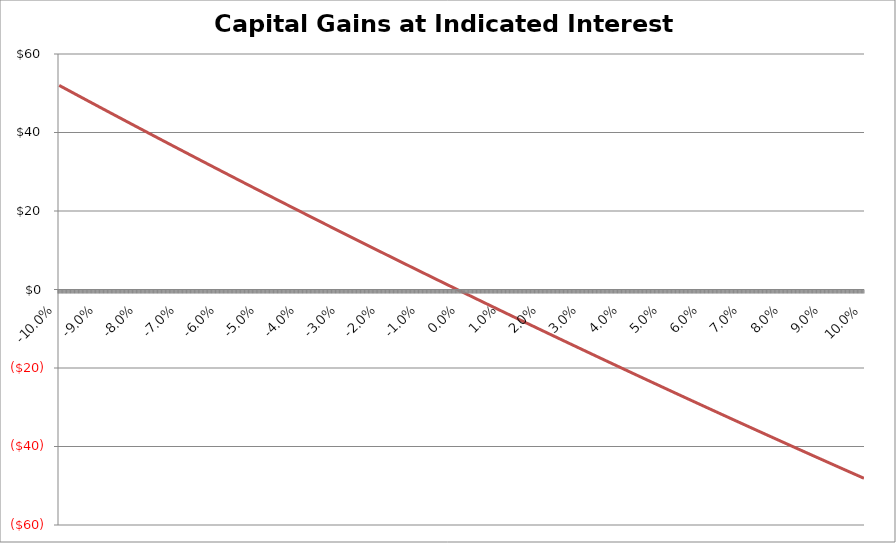
| Category | Capital Gains |
|---|---|
| -0.1 | 52 |
| -0.0999 | 51.945 |
| -0.0998 | 51.889 |
| -0.0997 | 51.834 |
| -0.0996 | 51.779 |
| -0.09949999999999999 | 51.723 |
| -0.09939999999999999 | 51.668 |
| -0.09929999999999999 | 51.613 |
| -0.09919999999999998 | 51.557 |
| -0.09909999999999998 | 51.502 |
| -0.09899999999999998 | 51.447 |
| -0.09889999999999997 | 51.391 |
| -0.09879999999999997 | 51.336 |
| -0.09869999999999997 | 51.281 |
| -0.09859999999999997 | 51.225 |
| -0.09849999999999996 | 51.17 |
| -0.09839999999999996 | 51.115 |
| -0.09829999999999996 | 51.06 |
| -0.09819999999999995 | 51.004 |
| -0.09809999999999995 | 50.949 |
| -0.09799999999999995 | 50.894 |
| -0.09789999999999995 | 50.839 |
| -0.09779999999999994 | 50.783 |
| -0.09769999999999994 | 50.728 |
| -0.09759999999999994 | 50.673 |
| -0.09749999999999993 | 50.618 |
| -0.09739999999999993 | 50.562 |
| -0.09729999999999993 | 50.507 |
| -0.09719999999999993 | 50.452 |
| -0.09709999999999992 | 50.397 |
| -0.09699999999999992 | 50.342 |
| -0.09689999999999992 | 50.286 |
| -0.09679999999999991 | 50.231 |
| -0.09669999999999991 | 50.176 |
| -0.09659999999999991 | 50.121 |
| -0.0964999999999999 | 50.066 |
| -0.0963999999999999 | 50.011 |
| -0.0962999999999999 | 49.955 |
| -0.0961999999999999 | 49.9 |
| -0.0960999999999999 | 49.845 |
| -0.09599999999999989 | 49.79 |
| -0.09589999999999989 | 49.735 |
| -0.09579999999999989 | 49.68 |
| -0.09569999999999988 | 49.625 |
| -0.09559999999999988 | 49.569 |
| -0.09549999999999988 | 49.514 |
| -0.09539999999999987 | 49.459 |
| -0.09529999999999987 | 49.404 |
| -0.09519999999999987 | 49.349 |
| -0.09509999999999987 | 49.294 |
| -0.09499999999999986 | 49.239 |
| -0.09489999999999986 | 49.184 |
| -0.09479999999999986 | 49.129 |
| -0.09469999999999985 | 49.074 |
| -0.09459999999999985 | 49.019 |
| -0.09449999999999985 | 48.964 |
| -0.09439999999999985 | 48.908 |
| -0.09429999999999984 | 48.853 |
| -0.09419999999999984 | 48.798 |
| -0.09409999999999984 | 48.743 |
| -0.09399999999999983 | 48.688 |
| -0.09389999999999983 | 48.633 |
| -0.09379999999999983 | 48.578 |
| -0.09369999999999983 | 48.523 |
| -0.09359999999999982 | 48.468 |
| -0.09349999999999982 | 48.413 |
| -0.09339999999999982 | 48.358 |
| -0.09329999999999981 | 48.303 |
| -0.09319999999999981 | 48.248 |
| -0.09309999999999981 | 48.193 |
| -0.0929999999999998 | 48.138 |
| -0.0928999999999998 | 48.083 |
| -0.0927999999999998 | 48.029 |
| -0.0926999999999998 | 47.974 |
| -0.0925999999999998 | 47.919 |
| -0.09249999999999979 | 47.864 |
| -0.09239999999999979 | 47.809 |
| -0.09229999999999978 | 47.754 |
| -0.09219999999999978 | 47.699 |
| -0.09209999999999978 | 47.644 |
| -0.09199999999999978 | 47.589 |
| -0.09189999999999977 | 47.534 |
| -0.09179999999999977 | 47.479 |
| -0.09169999999999977 | 47.424 |
| -0.09159999999999976 | 47.37 |
| -0.09149999999999976 | 47.315 |
| -0.09139999999999976 | 47.26 |
| -0.09129999999999976 | 47.205 |
| -0.09119999999999975 | 47.15 |
| -0.09109999999999975 | 47.095 |
| -0.09099999999999975 | 47.04 |
| -0.09089999999999974 | 46.985 |
| -0.09079999999999974 | 46.931 |
| -0.09069999999999974 | 46.876 |
| -0.09059999999999974 | 46.821 |
| -0.09049999999999973 | 46.766 |
| -0.09039999999999973 | 46.711 |
| -0.09029999999999973 | 46.657 |
| -0.09019999999999972 | 46.602 |
| -0.09009999999999972 | 46.547 |
| -0.08999999999999972 | 46.492 |
| -0.08989999999999972 | 46.437 |
| -0.08979999999999971 | 46.383 |
| -0.08969999999999971 | 46.328 |
| -0.08959999999999971 | 46.273 |
| -0.0894999999999997 | 46.218 |
| -0.0893999999999997 | 46.164 |
| -0.0892999999999997 | 46.109 |
| -0.0891999999999997 | 46.054 |
| -0.0890999999999997 | 45.999 |
| -0.08899999999999969 | 45.945 |
| -0.08889999999999969 | 45.89 |
| -0.08879999999999968 | 45.835 |
| -0.08869999999999968 | 45.78 |
| -0.08859999999999968 | 45.726 |
| -0.08849999999999968 | 45.671 |
| -0.08839999999999967 | 45.616 |
| -0.08829999999999967 | 45.562 |
| -0.08819999999999967 | 45.507 |
| -0.08809999999999966 | 45.452 |
| -0.08799999999999966 | 45.397 |
| -0.08789999999999966 | 45.343 |
| -0.08779999999999966 | 45.288 |
| -0.08769999999999965 | 45.233 |
| -0.08759999999999965 | 45.179 |
| -0.08749999999999965 | 45.124 |
| -0.08739999999999964 | 45.07 |
| -0.08729999999999964 | 45.015 |
| -0.08719999999999964 | 44.96 |
| -0.08709999999999964 | 44.906 |
| -0.08699999999999963 | 44.851 |
| -0.08689999999999963 | 44.796 |
| -0.08679999999999963 | 44.742 |
| -0.08669999999999962 | 44.687 |
| -0.08659999999999962 | 44.633 |
| -0.08649999999999962 | 44.578 |
| -0.08639999999999962 | 44.523 |
| -0.08629999999999961 | 44.469 |
| -0.08619999999999961 | 44.414 |
| -0.08609999999999961 | 44.36 |
| -0.0859999999999996 | 44.305 |
| -0.0858999999999996 | 44.251 |
| -0.0857999999999996 | 44.196 |
| -0.0856999999999996 | 44.141 |
| -0.0855999999999996 | 44.087 |
| -0.08549999999999959 | 44.032 |
| -0.08539999999999959 | 43.978 |
| -0.08529999999999958 | 43.923 |
| -0.08519999999999958 | 43.869 |
| -0.08509999999999958 | 43.814 |
| -0.08499999999999958 | 43.76 |
| -0.08489999999999957 | 43.705 |
| -0.08479999999999957 | 43.651 |
| -0.08469999999999957 | 43.596 |
| -0.08459999999999956 | 43.542 |
| -0.08449999999999956 | 43.487 |
| -0.08439999999999956 | 43.433 |
| -0.08429999999999956 | 43.378 |
| -0.08419999999999955 | 43.324 |
| -0.08409999999999955 | 43.269 |
| -0.08399999999999955 | 43.215 |
| -0.08389999999999954 | 43.161 |
| -0.08379999999999954 | 43.106 |
| -0.08369999999999954 | 43.052 |
| -0.08359999999999954 | 42.997 |
| -0.08349999999999953 | 42.943 |
| -0.08339999999999953 | 42.888 |
| -0.08329999999999953 | 42.834 |
| -0.08319999999999952 | 42.78 |
| -0.08309999999999952 | 42.725 |
| -0.08299999999999952 | 42.671 |
| -0.08289999999999952 | 42.616 |
| -0.08279999999999951 | 42.562 |
| -0.08269999999999951 | 42.508 |
| -0.08259999999999951 | 42.453 |
| -0.0824999999999995 | 42.399 |
| -0.0823999999999995 | 42.345 |
| -0.0822999999999995 | 42.29 |
| -0.0821999999999995 | 42.236 |
| -0.08209999999999949 | 42.182 |
| -0.08199999999999949 | 42.127 |
| -0.08189999999999949 | 42.073 |
| -0.08179999999999948 | 42.019 |
| -0.08169999999999948 | 41.964 |
| -0.08159999999999948 | 41.91 |
| -0.08149999999999948 | 41.856 |
| -0.08139999999999947 | 41.801 |
| -0.08129999999999947 | 41.747 |
| -0.08119999999999947 | 41.693 |
| -0.08109999999999946 | 41.638 |
| -0.08099999999999946 | 41.584 |
| -0.08089999999999946 | 41.53 |
| -0.08079999999999946 | 41.476 |
| -0.08069999999999945 | 41.421 |
| -0.08059999999999945 | 41.367 |
| -0.08049999999999945 | 41.313 |
| -0.08039999999999944 | 41.259 |
| -0.08029999999999944 | 41.204 |
| -0.08019999999999944 | 41.15 |
| -0.08009999999999944 | 41.096 |
| -0.07999999999999943 | 41.042 |
| -0.07989999999999943 | 40.987 |
| -0.07979999999999943 | 40.933 |
| -0.07969999999999942 | 40.879 |
| -0.07959999999999942 | 40.825 |
| -0.07949999999999942 | 40.771 |
| -0.07939999999999942 | 40.716 |
| -0.07929999999999941 | 40.662 |
| -0.07919999999999941 | 40.608 |
| -0.0790999999999994 | 40.554 |
| -0.0789999999999994 | 40.5 |
| -0.0788999999999994 | 40.446 |
| -0.0787999999999994 | 40.391 |
| -0.0786999999999994 | 40.337 |
| -0.07859999999999939 | 40.283 |
| -0.07849999999999939 | 40.229 |
| -0.07839999999999939 | 40.175 |
| -0.07829999999999938 | 40.121 |
| -0.07819999999999938 | 40.067 |
| -0.07809999999999938 | 40.012 |
| -0.07799999999999938 | 39.958 |
| -0.07789999999999937 | 39.904 |
| -0.07779999999999937 | 39.85 |
| -0.07769999999999937 | 39.796 |
| -0.07759999999999936 | 39.742 |
| -0.07749999999999936 | 39.688 |
| -0.07739999999999936 | 39.634 |
| -0.07729999999999936 | 39.58 |
| -0.07719999999999935 | 39.526 |
| -0.07709999999999935 | 39.472 |
| -0.07699999999999935 | 39.418 |
| -0.07689999999999934 | 39.364 |
| -0.07679999999999934 | 39.309 |
| -0.07669999999999934 | 39.255 |
| -0.07659999999999934 | 39.201 |
| -0.07649999999999933 | 39.147 |
| -0.07639999999999933 | 39.093 |
| -0.07629999999999933 | 39.039 |
| -0.07619999999999932 | 38.985 |
| -0.07609999999999932 | 38.931 |
| -0.07599999999999932 | 38.877 |
| -0.07589999999999932 | 38.823 |
| -0.07579999999999931 | 38.769 |
| -0.07569999999999931 | 38.715 |
| -0.0755999999999993 | 38.661 |
| -0.0754999999999993 | 38.607 |
| -0.0753999999999993 | 38.553 |
| -0.0752999999999993 | 38.5 |
| -0.0751999999999993 | 38.446 |
| -0.07509999999999929 | 38.392 |
| -0.07499999999999929 | 38.338 |
| -0.07489999999999929 | 38.284 |
| -0.07479999999999928 | 38.23 |
| -0.07469999999999928 | 38.176 |
| -0.07459999999999928 | 38.122 |
| -0.07449999999999928 | 38.068 |
| -0.07439999999999927 | 38.014 |
| -0.07429999999999927 | 37.96 |
| -0.07419999999999927 | 37.906 |
| -0.07409999999999926 | 37.852 |
| -0.07399999999999926 | 37.799 |
| -0.07389999999999926 | 37.745 |
| -0.07379999999999926 | 37.691 |
| -0.07369999999999925 | 37.637 |
| -0.07359999999999925 | 37.583 |
| -0.07349999999999925 | 37.529 |
| -0.07339999999999924 | 37.475 |
| -0.07329999999999924 | 37.421 |
| -0.07319999999999924 | 37.368 |
| -0.07309999999999924 | 37.314 |
| -0.07299999999999923 | 37.26 |
| -0.07289999999999923 | 37.206 |
| -0.07279999999999923 | 37.152 |
| -0.07269999999999922 | 37.099 |
| -0.07259999999999922 | 37.045 |
| -0.07249999999999922 | 36.991 |
| -0.07239999999999921 | 36.937 |
| -0.07229999999999921 | 36.883 |
| -0.07219999999999921 | 36.83 |
| -0.0720999999999992 | 36.776 |
| -0.0719999999999992 | 36.722 |
| -0.0718999999999992 | 36.668 |
| -0.0717999999999992 | 36.614 |
| -0.0716999999999992 | 36.561 |
| -0.07159999999999919 | 36.507 |
| -0.07149999999999919 | 36.453 |
| -0.07139999999999919 | 36.399 |
| -0.07129999999999918 | 36.346 |
| -0.07119999999999918 | 36.292 |
| -0.07109999999999918 | 36.238 |
| -0.07099999999999917 | 36.185 |
| -0.07089999999999917 | 36.131 |
| -0.07079999999999917 | 36.077 |
| -0.07069999999999917 | 36.023 |
| -0.07059999999999916 | 35.97 |
| -0.07049999999999916 | 35.916 |
| -0.07039999999999916 | 35.862 |
| -0.07029999999999915 | 35.809 |
| -0.07019999999999915 | 35.755 |
| -0.07009999999999915 | 35.701 |
| -0.06999999999999915 | 35.648 |
| -0.06989999999999914 | 35.594 |
| -0.06979999999999914 | 35.54 |
| -0.06969999999999914 | 35.487 |
| -0.06959999999999913 | 35.433 |
| -0.06949999999999913 | 35.379 |
| -0.06939999999999913 | 35.326 |
| -0.06929999999999913 | 35.272 |
| -0.06919999999999912 | 35.219 |
| -0.06909999999999912 | 35.165 |
| -0.06899999999999912 | 35.111 |
| -0.06889999999999911 | 35.058 |
| -0.06879999999999911 | 35.004 |
| -0.06869999999999911 | 34.951 |
| -0.0685999999999991 | 34.897 |
| -0.0684999999999991 | 34.843 |
| -0.0683999999999991 | 34.79 |
| -0.0682999999999991 | 34.736 |
| -0.0681999999999991 | 34.683 |
| -0.06809999999999909 | 34.629 |
| -0.06799999999999909 | 34.576 |
| -0.06789999999999909 | 34.522 |
| -0.06779999999999908 | 34.468 |
| -0.06769999999999908 | 34.415 |
| -0.06759999999999908 | 34.361 |
| -0.06749999999999907 | 34.308 |
| -0.06739999999999907 | 34.254 |
| -0.06729999999999907 | 34.201 |
| -0.06719999999999907 | 34.147 |
| -0.06709999999999906 | 34.094 |
| -0.06699999999999906 | 34.04 |
| -0.06689999999999906 | 33.987 |
| -0.06679999999999905 | 33.933 |
| -0.06669999999999905 | 33.88 |
| -0.06659999999999905 | 33.826 |
| -0.06649999999999905 | 33.773 |
| -0.06639999999999904 | 33.719 |
| -0.06629999999999904 | 33.666 |
| -0.06619999999999904 | 33.613 |
| -0.06609999999999903 | 33.559 |
| -0.06599999999999903 | 33.506 |
| -0.06589999999999903 | 33.452 |
| -0.06579999999999903 | 33.399 |
| -0.06569999999999902 | 33.345 |
| -0.06559999999999902 | 33.292 |
| -0.06549999999999902 | 33.239 |
| -0.06539999999999901 | 33.185 |
| -0.06529999999999901 | 33.132 |
| -0.06519999999999901 | 33.078 |
| -0.065099999999999 | 33.025 |
| -0.064999999999999 | 32.972 |
| -0.064899999999999 | 32.918 |
| -0.064799999999999 | 32.865 |
| -0.064699999999999 | 32.811 |
| -0.06459999999999899 | 32.758 |
| -0.06449999999999899 | 32.705 |
| -0.06439999999999899 | 32.651 |
| -0.06429999999999898 | 32.598 |
| -0.06419999999999898 | 32.545 |
| -0.06409999999999898 | 32.491 |
| -0.06399999999999897 | 32.438 |
| -0.06389999999999897 | 32.385 |
| -0.06379999999999897 | 32.331 |
| -0.06369999999999897 | 32.278 |
| -0.06359999999999896 | 32.225 |
| -0.06349999999999896 | 32.171 |
| -0.06339999999999896 | 32.118 |
| -0.06329999999999895 | 32.065 |
| -0.06319999999999895 | 32.012 |
| -0.06309999999999895 | 31.958 |
| -0.06299999999999895 | 31.905 |
| -0.06289999999999894 | 31.852 |
| -0.06279999999999894 | 31.798 |
| -0.06269999999999894 | 31.745 |
| -0.06259999999999893 | 31.692 |
| -0.06249999999999893 | 31.639 |
| -0.06239999999999893 | 31.585 |
| -0.062299999999998926 | 31.532 |
| -0.06219999999999892 | 31.479 |
| -0.06209999999999892 | 31.426 |
| -0.06199999999999892 | 31.373 |
| -0.061899999999998914 | 31.319 |
| -0.06179999999999891 | 31.266 |
| -0.06169999999999891 | 31.213 |
| -0.061599999999998906 | 31.16 |
| -0.0614999999999989 | 31.107 |
| -0.0613999999999989 | 31.053 |
| -0.0612999999999989 | 31 |
| -0.061199999999998894 | 30.947 |
| -0.06109999999999889 | 30.894 |
| -0.06099999999999889 | 30.841 |
| -0.060899999999998886 | 30.787 |
| -0.06079999999999888 | 30.734 |
| -0.06069999999999888 | 30.681 |
| -0.06059999999999888 | 30.628 |
| -0.060499999999998874 | 30.575 |
| -0.06039999999999887 | 30.522 |
| -0.06029999999999887 | 30.469 |
| -0.060199999999998866 | 30.416 |
| -0.06009999999999886 | 30.362 |
| -0.05999999999999886 | 30.309 |
| -0.05989999999999886 | 30.256 |
| -0.059799999999998854 | 30.203 |
| -0.05969999999999885 | 30.15 |
| -0.05959999999999885 | 30.097 |
| -0.059499999999998845 | 30.044 |
| -0.05939999999999884 | 29.991 |
| -0.05929999999999884 | 29.938 |
| -0.05919999999999884 | 29.885 |
| -0.059099999999998834 | 29.832 |
| -0.05899999999999883 | 29.778 |
| -0.05889999999999883 | 29.725 |
| -0.058799999999998825 | 29.672 |
| -0.05869999999999882 | 29.619 |
| -0.05859999999999882 | 29.566 |
| -0.05849999999999882 | 29.513 |
| -0.058399999999998814 | 29.46 |
| -0.05829999999999881 | 29.407 |
| -0.05819999999999881 | 29.354 |
| -0.058099999999998805 | 29.301 |
| -0.0579999999999988 | 29.248 |
| -0.0578999999999988 | 29.195 |
| -0.0577999999999988 | 29.142 |
| -0.057699999999998794 | 29.089 |
| -0.05759999999999879 | 29.036 |
| -0.05749999999999879 | 28.983 |
| -0.057399999999998785 | 28.93 |
| -0.05729999999999878 | 28.877 |
| -0.05719999999999878 | 28.824 |
| -0.05709999999999878 | 28.771 |
| -0.056999999999998774 | 28.718 |
| -0.05689999999999877 | 28.666 |
| -0.05679999999999877 | 28.613 |
| -0.056699999999998765 | 28.56 |
| -0.05659999999999876 | 28.507 |
| -0.05649999999999876 | 28.454 |
| -0.05639999999999876 | 28.401 |
| -0.056299999999998754 | 28.348 |
| -0.05619999999999875 | 28.295 |
| -0.05609999999999875 | 28.242 |
| -0.055999999999998745 | 28.189 |
| -0.05589999999999874 | 28.136 |
| -0.05579999999999874 | 28.084 |
| -0.05569999999999874 | 28.031 |
| -0.055599999999998734 | 27.978 |
| -0.05549999999999873 | 27.925 |
| -0.05539999999999873 | 27.872 |
| -0.055299999999998725 | 27.819 |
| -0.05519999999999872 | 27.766 |
| -0.05509999999999872 | 27.714 |
| -0.05499999999999872 | 27.661 |
| -0.054899999999998714 | 27.608 |
| -0.05479999999999871 | 27.555 |
| -0.05469999999999871 | 27.502 |
| -0.054599999999998705 | 27.449 |
| -0.0544999999999987 | 27.397 |
| -0.0543999999999987 | 27.344 |
| -0.0542999999999987 | 27.291 |
| -0.054199999999998694 | 27.238 |
| -0.05409999999999869 | 27.185 |
| -0.05399999999999869 | 27.133 |
| -0.053899999999998685 | 27.08 |
| -0.05379999999999868 | 27.027 |
| -0.05369999999999868 | 26.974 |
| -0.053599999999998676 | 26.921 |
| -0.053499999999998674 | 26.869 |
| -0.05339999999999867 | 26.816 |
| -0.05329999999999867 | 26.763 |
| -0.053199999999998665 | 26.71 |
| -0.05309999999999866 | 26.658 |
| -0.05299999999999866 | 26.605 |
| -0.052899999999998656 | 26.552 |
| -0.052799999999998654 | 26.5 |
| -0.05269999999999865 | 26.447 |
| -0.05259999999999865 | 26.394 |
| -0.052499999999998645 | 26.341 |
| -0.05239999999999864 | 26.289 |
| -0.05229999999999864 | 26.236 |
| -0.052199999999998636 | 26.183 |
| -0.052099999999998634 | 26.131 |
| -0.05199999999999863 | 26.078 |
| -0.05189999999999863 | 26.025 |
| -0.051799999999998625 | 25.973 |
| -0.05169999999999862 | 25.92 |
| -0.05159999999999862 | 25.867 |
| -0.051499999999998616 | 25.815 |
| -0.05139999999999861 | 25.762 |
| -0.05129999999999861 | 25.709 |
| -0.05119999999999861 | 25.657 |
| -0.051099999999998605 | 25.604 |
| -0.0509999999999986 | 25.552 |
| -0.0508999999999986 | 25.499 |
| -0.050799999999998596 | 25.446 |
| -0.05069999999999859 | 25.394 |
| -0.05059999999999859 | 25.341 |
| -0.05049999999999859 | 25.289 |
| -0.050399999999998585 | 25.236 |
| -0.05029999999999858 | 25.183 |
| -0.05019999999999858 | 25.131 |
| -0.050099999999998576 | 25.078 |
| -0.04999999999999857 | 25.026 |
| -0.04989999999999857 | 24.973 |
| -0.04979999999999857 | 24.921 |
| -0.049699999999998565 | 24.868 |
| -0.04959999999999856 | 24.815 |
| -0.04949999999999856 | 24.763 |
| -0.049399999999998556 | 24.71 |
| -0.04929999999999855 | 24.658 |
| -0.04919999999999855 | 24.605 |
| -0.04909999999999855 | 24.553 |
| -0.048999999999998545 | 24.5 |
| -0.04889999999999854 | 24.448 |
| -0.04879999999999854 | 24.395 |
| -0.048699999999998536 | 24.343 |
| -0.04859999999999853 | 24.29 |
| -0.04849999999999853 | 24.238 |
| -0.04839999999999853 | 24.185 |
| -0.048299999999998525 | 24.133 |
| -0.04819999999999852 | 24.08 |
| -0.04809999999999852 | 24.028 |
| -0.047999999999998516 | 23.975 |
| -0.04789999999999851 | 23.923 |
| -0.04779999999999851 | 23.871 |
| -0.04769999999999851 | 23.818 |
| -0.047599999999998505 | 23.766 |
| -0.0474999999999985 | 23.713 |
| -0.0473999999999985 | 23.661 |
| -0.047299999999998496 | 23.608 |
| -0.04719999999999849 | 23.556 |
| -0.04709999999999849 | 23.504 |
| -0.04699999999999849 | 23.451 |
| -0.046899999999998485 | 23.399 |
| -0.04679999999999848 | 23.346 |
| -0.04669999999999848 | 23.294 |
| -0.046599999999998476 | 23.242 |
| -0.04649999999999847 | 23.189 |
| -0.04639999999999847 | 23.137 |
| -0.04629999999999847 | 23.084 |
| -0.046199999999998465 | 23.032 |
| -0.04609999999999846 | 22.98 |
| -0.04599999999999846 | 22.927 |
| -0.045899999999998456 | 22.875 |
| -0.04579999999999845 | 22.823 |
| -0.04569999999999845 | 22.77 |
| -0.04559999999999845 | 22.718 |
| -0.045499999999998444 | 22.666 |
| -0.04539999999999844 | 22.613 |
| -0.04529999999999844 | 22.561 |
| -0.045199999999998436 | 22.509 |
| -0.04509999999999843 | 22.456 |
| -0.04499999999999843 | 22.404 |
| -0.04489999999999843 | 22.352 |
| -0.044799999999998424 | 22.3 |
| -0.04469999999999842 | 22.247 |
| -0.04459999999999842 | 22.195 |
| -0.044499999999998416 | 22.143 |
| -0.04439999999999841 | 22.09 |
| -0.04429999999999841 | 22.038 |
| -0.04419999999999841 | 21.986 |
| -0.044099999999998404 | 21.934 |
| -0.0439999999999984 | 21.881 |
| -0.0438999999999984 | 21.829 |
| -0.043799999999998396 | 21.777 |
| -0.04369999999999839 | 21.725 |
| -0.04359999999999839 | 21.672 |
| -0.04349999999999839 | 21.62 |
| -0.043399999999998384 | 21.568 |
| -0.04329999999999838 | 21.516 |
| -0.04319999999999838 | 21.464 |
| -0.043099999999998376 | 21.411 |
| -0.04299999999999837 | 21.359 |
| -0.04289999999999837 | 21.307 |
| -0.04279999999999837 | 21.255 |
| -0.042699999999998364 | 21.203 |
| -0.04259999999999836 | 21.151 |
| -0.04249999999999836 | 21.098 |
| -0.042399999999998356 | 21.046 |
| -0.04229999999999835 | 20.994 |
| -0.04219999999999835 | 20.942 |
| -0.04209999999999835 | 20.89 |
| -0.041999999999998344 | 20.838 |
| -0.04189999999999834 | 20.785 |
| -0.04179999999999834 | 20.733 |
| -0.041699999999998336 | 20.681 |
| -0.04159999999999833 | 20.629 |
| -0.04149999999999833 | 20.577 |
| -0.04139999999999833 | 20.525 |
| -0.041299999999998324 | 20.473 |
| -0.04119999999999832 | 20.421 |
| -0.04109999999999832 | 20.369 |
| -0.040999999999998316 | 20.316 |
| -0.04089999999999831 | 20.264 |
| -0.04079999999999831 | 20.212 |
| -0.04069999999999831 | 20.16 |
| -0.040599999999998304 | 20.108 |
| -0.0404999999999983 | 20.056 |
| -0.0403999999999983 | 20.004 |
| -0.040299999999998296 | 19.952 |
| -0.04019999999999829 | 19.9 |
| -0.04009999999999829 | 19.848 |
| -0.03999999999999829 | 19.796 |
| -0.039899999999998284 | 19.744 |
| -0.03979999999999828 | 19.692 |
| -0.03969999999999828 | 19.64 |
| -0.039599999999998275 | 19.588 |
| -0.03949999999999827 | 19.536 |
| -0.03939999999999827 | 19.484 |
| -0.03929999999999827 | 19.432 |
| -0.039199999999998264 | 19.38 |
| -0.03909999999999826 | 19.328 |
| -0.03899999999999826 | 19.276 |
| -0.038899999999998255 | 19.224 |
| -0.03879999999999825 | 19.172 |
| -0.03869999999999825 | 19.12 |
| -0.03859999999999825 | 19.068 |
| -0.038499999999998244 | 19.016 |
| -0.03839999999999824 | 18.964 |
| -0.03829999999999824 | 18.912 |
| -0.038199999999998235 | 18.86 |
| -0.03809999999999823 | 18.808 |
| -0.03799999999999823 | 18.756 |
| -0.03789999999999823 | 18.704 |
| -0.037799999999998224 | 18.653 |
| -0.03769999999999822 | 18.601 |
| -0.03759999999999822 | 18.549 |
| -0.037499999999998215 | 18.497 |
| -0.03739999999999821 | 18.445 |
| -0.03729999999999821 | 18.393 |
| -0.03719999999999821 | 18.341 |
| -0.037099999999998204 | 18.289 |
| -0.0369999999999982 | 18.237 |
| -0.0368999999999982 | 18.186 |
| -0.036799999999998195 | 18.134 |
| -0.03669999999999819 | 18.082 |
| -0.03659999999999819 | 18.03 |
| -0.03649999999999819 | 17.978 |
| -0.036399999999998184 | 17.926 |
| -0.03629999999999818 | 17.874 |
| -0.03619999999999818 | 17.823 |
| -0.036099999999998175 | 17.771 |
| -0.03599999999999817 | 17.719 |
| -0.03589999999999817 | 17.667 |
| -0.03579999999999817 | 17.615 |
| -0.035699999999998164 | 17.564 |
| -0.03559999999999816 | 17.512 |
| -0.03549999999999816 | 17.46 |
| -0.035399999999998155 | 17.408 |
| -0.03529999999999815 | 17.356 |
| -0.03519999999999815 | 17.305 |
| -0.03509999999999815 | 17.253 |
| -0.034999999999998144 | 17.201 |
| -0.03489999999999814 | 17.149 |
| -0.03479999999999814 | 17.097 |
| -0.034699999999998135 | 17.046 |
| -0.03459999999999813 | 16.994 |
| -0.03449999999999813 | 16.942 |
| -0.034399999999998127 | 16.891 |
| -0.034299999999998124 | 16.839 |
| -0.03419999999999812 | 16.787 |
| -0.03409999999999812 | 16.735 |
| -0.033999999999998115 | 16.684 |
| -0.03389999999999811 | 16.632 |
| -0.03379999999999811 | 16.58 |
| -0.033699999999998106 | 16.529 |
| -0.033599999999998104 | 16.477 |
| -0.0334999999999981 | 16.425 |
| -0.0333999999999981 | 16.373 |
| -0.033299999999998095 | 16.322 |
| -0.03319999999999809 | 16.27 |
| -0.03309999999999809 | 16.218 |
| -0.032999999999998086 | 16.167 |
| -0.032899999999998084 | 16.115 |
| -0.03279999999999808 | 16.063 |
| -0.03269999999999808 | 16.012 |
| -0.032599999999998075 | 15.96 |
| -0.03249999999999807 | 15.909 |
| -0.03239999999999807 | 15.857 |
| -0.032299999999998066 | 15.805 |
| -0.032199999999998064 | 15.754 |
| -0.03209999999999806 | 15.702 |
| -0.03199999999999806 | 15.65 |
| -0.031899999999998055 | 15.599 |
| -0.03179999999999805 | 15.547 |
| -0.03169999999999805 | 15.496 |
| -0.031599999999998046 | 15.444 |
| -0.03149999999999804 | 15.392 |
| -0.03139999999999804 | 15.341 |
| -0.03129999999999804 | 15.289 |
| -0.03119999999999804 | 15.238 |
| -0.03109999999999804 | 15.186 |
| -0.03099999999999804 | 15.135 |
| -0.03089999999999804 | 15.083 |
| -0.03079999999999804 | 15.031 |
| -0.03069999999999804 | 14.98 |
| -0.030599999999998042 | 14.928 |
| -0.030499999999998043 | 14.877 |
| -0.030399999999998043 | 14.825 |
| -0.030299999999998044 | 14.774 |
| -0.030199999999998044 | 14.722 |
| -0.030099999999998045 | 14.671 |
| -0.029999999999998046 | 14.619 |
| -0.029899999999998046 | 14.568 |
| -0.029799999999998047 | 14.516 |
| -0.029699999999998047 | 14.465 |
| -0.029599999999998048 | 14.413 |
| -0.02949999999999805 | 14.362 |
| -0.02939999999999805 | 14.31 |
| -0.02929999999999805 | 14.259 |
| -0.02919999999999805 | 14.207 |
| -0.02909999999999805 | 14.156 |
| -0.02899999999999805 | 14.105 |
| -0.028899999999998052 | 14.053 |
| -0.028799999999998053 | 14.002 |
| -0.028699999999998053 | 13.95 |
| -0.028599999999998054 | 13.899 |
| -0.028499999999998055 | 13.847 |
| -0.028399999999998055 | 13.796 |
| -0.028299999999998056 | 13.744 |
| -0.028199999999998056 | 13.693 |
| -0.028099999999998057 | 13.642 |
| -0.027999999999998058 | 13.59 |
| -0.02789999999999806 | 13.539 |
| -0.02779999999999806 | 13.487 |
| -0.02769999999999806 | 13.436 |
| -0.02759999999999806 | 13.385 |
| -0.02749999999999806 | 13.333 |
| -0.02739999999999806 | 13.282 |
| -0.027299999999998062 | 13.231 |
| -0.027199999999998063 | 13.179 |
| -0.027099999999998063 | 13.128 |
| -0.026999999999998064 | 13.077 |
| -0.026899999999998064 | 13.025 |
| -0.026799999999998065 | 12.974 |
| -0.026699999999998066 | 12.923 |
| -0.026599999999998066 | 12.871 |
| -0.026499999999998067 | 12.82 |
| -0.026399999999998067 | 12.769 |
| -0.026299999999998068 | 12.717 |
| -0.02619999999999807 | 12.666 |
| -0.02609999999999807 | 12.615 |
| -0.02599999999999807 | 12.563 |
| -0.02589999999999807 | 12.512 |
| -0.02579999999999807 | 12.461 |
| -0.02569999999999807 | 12.409 |
| -0.025599999999998072 | 12.358 |
| -0.025499999999998073 | 12.307 |
| -0.025399999999998073 | 12.256 |
| -0.025299999999998074 | 12.204 |
| -0.025199999999998075 | 12.153 |
| -0.025099999999998075 | 12.102 |
| -0.024999999999998076 | 12.051 |
| -0.024899999999998076 | 11.999 |
| -0.024799999999998077 | 11.948 |
| -0.024699999999998078 | 11.897 |
| -0.024599999999998078 | 11.846 |
| -0.02449999999999808 | 11.794 |
| -0.02439999999999808 | 11.743 |
| -0.02429999999999808 | 11.692 |
| -0.02419999999999808 | 11.641 |
| -0.02409999999999808 | 11.59 |
| -0.023999999999998082 | 11.538 |
| -0.023899999999998083 | 11.487 |
| -0.023799999999998083 | 11.436 |
| -0.023699999999998084 | 11.385 |
| -0.023599999999998084 | 11.334 |
| -0.023499999999998085 | 11.283 |
| -0.023399999999998086 | 11.231 |
| -0.023299999999998086 | 11.18 |
| -0.023199999999998087 | 11.129 |
| -0.023099999999998087 | 11.078 |
| -0.022999999999998088 | 11.027 |
| -0.02289999999999809 | 10.976 |
| -0.02279999999999809 | 10.925 |
| -0.02269999999999809 | 10.873 |
| -0.02259999999999809 | 10.822 |
| -0.02249999999999809 | 10.771 |
| -0.02239999999999809 | 10.72 |
| -0.022299999999998092 | 10.669 |
| -0.022199999999998093 | 10.618 |
| -0.022099999999998093 | 10.567 |
| -0.021999999999998094 | 10.516 |
| -0.021899999999998095 | 10.465 |
| -0.021799999999998095 | 10.414 |
| -0.021699999999998096 | 10.362 |
| -0.021599999999998096 | 10.311 |
| -0.021499999999998097 | 10.26 |
| -0.021399999999998098 | 10.209 |
| -0.021299999999998098 | 10.158 |
| -0.0211999999999981 | 10.107 |
| -0.0210999999999981 | 10.056 |
| -0.0209999999999981 | 10.005 |
| -0.0208999999999981 | 9.954 |
| -0.0207999999999981 | 9.903 |
| -0.020699999999998102 | 9.852 |
| -0.020599999999998102 | 9.801 |
| -0.020499999999998103 | 9.75 |
| -0.020399999999998104 | 9.699 |
| -0.020299999999998104 | 9.648 |
| -0.020199999999998105 | 9.597 |
| -0.020099999999998105 | 9.546 |
| -0.019999999999998106 | 9.495 |
| -0.019899999999998107 | 9.444 |
| -0.019799999999998107 | 9.393 |
| -0.019699999999998108 | 9.342 |
| -0.01959999999999811 | 9.291 |
| -0.01949999999999811 | 9.24 |
| -0.01939999999999811 | 9.189 |
| -0.01929999999999811 | 9.138 |
| -0.01919999999999811 | 9.087 |
| -0.01909999999999811 | 9.036 |
| -0.018999999999998112 | 8.985 |
| -0.018899999999998113 | 8.934 |
| -0.018799999999998113 | 8.884 |
| -0.018699999999998114 | 8.833 |
| -0.018599999999998115 | 8.782 |
| -0.018499999999998115 | 8.731 |
| -0.018399999999998116 | 8.68 |
| -0.018299999999998116 | 8.629 |
| -0.018199999999998117 | 8.578 |
| -0.018099999999998118 | 8.527 |
| -0.017999999999998118 | 8.476 |
| -0.01789999999999812 | 8.425 |
| -0.01779999999999812 | 8.375 |
| -0.01769999999999812 | 8.324 |
| -0.01759999999999812 | 8.273 |
| -0.01749999999999812 | 8.222 |
| -0.017399999999998122 | 8.171 |
| -0.017299999999998122 | 8.12 |
| -0.017199999999998123 | 8.069 |
| -0.017099999999998124 | 8.019 |
| -0.016999999999998124 | 7.968 |
| -0.016899999999998125 | 7.917 |
| -0.016799999999998125 | 7.866 |
| -0.016699999999998126 | 7.815 |
| -0.016599999999998127 | 7.764 |
| -0.016499999999998127 | 7.714 |
| -0.016399999999998128 | 7.663 |
| -0.01629999999999813 | 7.612 |
| -0.01619999999999813 | 7.561 |
| -0.01609999999999813 | 7.51 |
| -0.01599999999999813 | 7.46 |
| -0.01589999999999813 | 7.409 |
| -0.01579999999999813 | 7.358 |
| -0.015699999999998132 | 7.307 |
| -0.015599999999998133 | 7.257 |
| -0.015499999999998133 | 7.206 |
| -0.015399999999998134 | 7.155 |
| -0.015299999999998135 | 7.104 |
| -0.015199999999998135 | 7.054 |
| -0.015099999999998136 | 7.003 |
| -0.014999999999998136 | 6.952 |
| -0.014899999999998137 | 6.901 |
| -0.014799999999998138 | 6.851 |
| -0.014699999999998138 | 6.8 |
| -0.014599999999998139 | 6.749 |
| -0.01449999999999814 | 6.699 |
| -0.01439999999999814 | 6.648 |
| -0.01429999999999814 | 6.597 |
| -0.014199999999998141 | 6.546 |
| -0.014099999999998142 | 6.496 |
| -0.013999999999998142 | 6.445 |
| -0.013899999999998143 | 6.394 |
| -0.013799999999998144 | 6.344 |
| -0.013699999999998144 | 6.293 |
| -0.013599999999998145 | 6.242 |
| -0.013499999999998145 | 6.192 |
| -0.013399999999998146 | 6.141 |
| -0.013299999999998147 | 6.091 |
| -0.013199999999998147 | 6.04 |
| -0.013099999999998148 | 5.989 |
| -0.012999999999998148 | 5.939 |
| -0.012899999999998149 | 5.888 |
| -0.01279999999999815 | 5.837 |
| -0.01269999999999815 | 5.787 |
| -0.012599999999998151 | 5.736 |
| -0.012499999999998151 | 5.686 |
| -0.012399999999998152 | 5.635 |
| -0.012299999999998153 | 5.584 |
| -0.012199999999998153 | 5.534 |
| -0.012099999999998154 | 5.483 |
| -0.011999999999998155 | 5.433 |
| -0.011899999999998155 | 5.382 |
| -0.011799999999998156 | 5.331 |
| -0.011699999999998156 | 5.281 |
| -0.011599999999998157 | 5.23 |
| -0.011499999999998158 | 5.18 |
| -0.011399999999998158 | 5.129 |
| -0.011299999999998159 | 5.079 |
| -0.01119999999999816 | 5.028 |
| -0.01109999999999816 | 4.978 |
| -0.01099999999999816 | 4.927 |
| -0.010899999999998161 | 4.877 |
| -0.010799999999998162 | 4.826 |
| -0.010699999999998162 | 4.776 |
| -0.010599999999998163 | 4.725 |
| -0.010499999999998164 | 4.675 |
| -0.010399999999998164 | 4.624 |
| -0.010299999999998165 | 4.574 |
| -0.010199999999998165 | 4.523 |
| -0.010099999999998166 | 4.473 |
| -0.009999999999998167 | 4.422 |
| -0.009899999999998167 | 4.372 |
| -0.009799999999998168 | 4.321 |
| -0.009699999999998168 | 4.271 |
| -0.009599999999998169 | 4.22 |
| -0.00949999999999817 | 4.17 |
| -0.00939999999999817 | 4.119 |
| -0.00929999999999817 | 4.069 |
| -0.009199999999998171 | 4.018 |
| -0.009099999999998172 | 3.968 |
| -0.008999999999998173 | 3.918 |
| -0.008899999999998173 | 3.867 |
| -0.008799999999998174 | 3.817 |
| -0.008699999999998174 | 3.766 |
| -0.008599999999998175 | 3.716 |
| -0.008499999999998176 | 3.666 |
| -0.008399999999998176 | 3.615 |
| -0.008299999999998177 | 3.565 |
| -0.008199999999998177 | 3.514 |
| -0.008099999999998178 | 3.464 |
| -0.007999999999998179 | 3.414 |
| -0.00789999999999818 | 3.363 |
| -0.007799999999998179 | 3.313 |
| -0.007699999999998179 | 3.263 |
| -0.0075999999999981785 | 3.212 |
| -0.007499999999998178 | 3.162 |
| -0.007399999999998178 | 3.112 |
| -0.007299999999998178 | 3.061 |
| -0.0071999999999981775 | 3.011 |
| -0.007099999999998177 | 2.961 |
| -0.006999999999998177 | 2.91 |
| -0.006899999999998177 | 2.86 |
| -0.006799999999998176 | 2.81 |
| -0.006699999999998176 | 2.759 |
| -0.006599999999998176 | 2.709 |
| -0.006499999999998176 | 2.659 |
| -0.006399999999998175 | 2.608 |
| -0.006299999999998175 | 2.558 |
| -0.006199999999998175 | 2.508 |
| -0.006099999999998175 | 2.457 |
| -0.005999999999998174 | 2.407 |
| -0.005899999999998174 | 2.357 |
| -0.005799999999998174 | 2.307 |
| -0.0056999999999981735 | 2.256 |
| -0.005599999999998173 | 2.206 |
| -0.005499999999998173 | 2.156 |
| -0.005399999999998173 | 2.106 |
| -0.0052999999999981725 | 2.055 |
| -0.005199999999998172 | 2.005 |
| -0.005099999999998172 | 1.955 |
| -0.004999999999998172 | 1.905 |
| -0.0048999999999981714 | 1.855 |
| -0.004799999999998171 | 1.804 |
| -0.004699999999998171 | 1.754 |
| -0.004599999999998171 | 1.704 |
| -0.00449999999999817 | 1.654 |
| -0.00439999999999817 | 1.604 |
| -0.00429999999999817 | 1.553 |
| -0.00419999999999817 | 1.503 |
| -0.004099999999998169 | 1.453 |
| -0.003999999999998169 | 1.403 |
| -0.0038999999999981693 | 1.353 |
| -0.0037999999999981694 | 1.302 |
| -0.0036999999999981696 | 1.252 |
| -0.0035999999999981698 | 1.202 |
| -0.00349999999999817 | 1.152 |
| -0.00339999999999817 | 1.102 |
| -0.0032999999999981703 | 1.052 |
| -0.0031999999999981705 | 1.002 |
| -0.0030999999999981706 | 0.951 |
| -0.002999999999998171 | 0.901 |
| -0.002899999999998171 | 0.851 |
| -0.002799999999998171 | 0.801 |
| -0.0026999999999981713 | 0.751 |
| -0.0025999999999981715 | 0.701 |
| -0.0024999999999981717 | 0.651 |
| -0.002399999999998172 | 0.601 |
| -0.002299999999998172 | 0.551 |
| -0.002199999999998172 | 0.501 |
| -0.0020999999999981723 | 0.45 |
| -0.0019999999999981725 | 0.4 |
| -0.0018999999999981725 | 0.35 |
| -0.0017999999999981724 | 0.3 |
| -0.0016999999999981724 | 0.25 |
| -0.0015999999999981723 | 0.2 |
| -0.0014999999999981723 | 0.15 |
| -0.0013999999999981722 | 0.1 |
| -0.0012999999999981722 | 0.05 |
| -0.0011999999999981721 | 0 |
| -0.001099999999998172 | -0.05 |
| -0.000999999999998172 | -0.1 |
| -0.000899999999998172 | -0.15 |
| -0.000799999999998172 | -0.2 |
| -0.0006999999999981719 | -0.25 |
| -0.0005999999999981719 | -0.3 |
| -0.0004999999999981718 | -0.35 |
| -0.00039999999999817184 | -0.4 |
| -0.00029999999999817185 | -0.45 |
| -0.00019999999999817185 | -0.5 |
| -9.999999999817185e-05 | -0.55 |
| 1.8281545981907454e-15 | -0.583 |
| 0.00010000000000182816 | -0.65 |
| 0.00020000000000182816 | -0.7 |
| 0.00030000000000182816 | -0.75 |
| 0.00040000000000182815 | -0.8 |
| 0.0005000000000018282 | -0.85 |
| 0.0006000000000018282 | -0.9 |
| 0.0007000000000018283 | -0.95 |
| 0.0008000000000018283 | -1 |
| 0.0009000000000018284 | -1.05 |
| 0.0010000000000018284 | -1.099 |
| 0.0011000000000018285 | -1.149 |
| 0.0012000000000018285 | -1.199 |
| 0.0013000000000018286 | -1.249 |
| 0.0014000000000018286 | -1.299 |
| 0.0015000000000018286 | -1.349 |
| 0.0016000000000018287 | -1.399 |
| 0.0017000000000018287 | -1.449 |
| 0.0018000000000018288 | -1.499 |
| 0.0019000000000018288 | -1.549 |
| 0.002000000000001829 | -1.598 |
| 0.0021000000000018287 | -1.648 |
| 0.0022000000000018285 | -1.698 |
| 0.0023000000000018284 | -1.748 |
| 0.002400000000001828 | -1.798 |
| 0.002500000000001828 | -1.848 |
| 0.002600000000001828 | -1.898 |
| 0.0027000000000018277 | -1.947 |
| 0.0028000000000018275 | -1.997 |
| 0.0029000000000018273 | -2.047 |
| 0.003000000000001827 | -2.097 |
| 0.003100000000001827 | -2.147 |
| 0.003200000000001827 | -2.196 |
| 0.0033000000000018266 | -2.246 |
| 0.0034000000000018265 | -2.296 |
| 0.0035000000000018263 | -2.346 |
| 0.003600000000001826 | -2.396 |
| 0.003700000000001826 | -2.445 |
| 0.003800000000001826 | -2.495 |
| 0.0039000000000018256 | -2.545 |
| 0.004000000000001826 | -2.595 |
| 0.004100000000001826 | -2.645 |
| 0.004200000000001826 | -2.694 |
| 0.004300000000001827 | -2.744 |
| 0.004400000000001827 | -2.794 |
| 0.004500000000001827 | -2.844 |
| 0.0046000000000018275 | -2.893 |
| 0.004700000000001828 | -2.943 |
| 0.004800000000001828 | -2.993 |
| 0.004900000000001828 | -3.043 |
| 0.0050000000000018285 | -3.092 |
| 0.005100000000001829 | -3.142 |
| 0.005200000000001829 | -3.192 |
| 0.005300000000001829 | -3.241 |
| 0.0054000000000018296 | -3.291 |
| 0.00550000000000183 | -3.341 |
| 0.00560000000000183 | -3.391 |
| 0.00570000000000183 | -3.44 |
| 0.005800000000001831 | -3.49 |
| 0.005900000000001831 | -3.54 |
| 0.006000000000001831 | -3.589 |
| 0.006100000000001831 | -3.639 |
| 0.006200000000001832 | -3.689 |
| 0.006300000000001832 | -3.738 |
| 0.006400000000001832 | -3.788 |
| 0.0065000000000018324 | -3.838 |
| 0.006600000000001833 | -3.887 |
| 0.006700000000001833 | -3.937 |
| 0.006800000000001833 | -3.986 |
| 0.0069000000000018335 | -4.036 |
| 0.007000000000001834 | -4.086 |
| 0.007100000000001834 | -4.135 |
| 0.007200000000001834 | -4.185 |
| 0.0073000000000018345 | -4.235 |
| 0.007400000000001835 | -4.284 |
| 0.007500000000001835 | -4.334 |
| 0.007600000000001835 | -4.383 |
| 0.007700000000001836 | -4.433 |
| 0.007800000000001836 | -4.483 |
| 0.007900000000001836 | -4.532 |
| 0.008000000000001836 | -4.582 |
| 0.008100000000001835 | -4.631 |
| 0.008200000000001834 | -4.681 |
| 0.008300000000001834 | -4.73 |
| 0.008400000000001833 | -4.78 |
| 0.008500000000001832 | -4.829 |
| 0.008600000000001832 | -4.879 |
| 0.008700000000001831 | -4.929 |
| 0.00880000000000183 | -4.978 |
| 0.00890000000000183 | -5.028 |
| 0.00900000000000183 | -5.077 |
| 0.009100000000001829 | -5.127 |
| 0.009200000000001828 | -5.176 |
| 0.009300000000001828 | -5.226 |
| 0.009400000000001827 | -5.275 |
| 0.009500000000001826 | -5.325 |
| 0.009600000000001826 | -5.374 |
| 0.009700000000001825 | -5.424 |
| 0.009800000000001825 | -5.473 |
| 0.009900000000001824 | -5.523 |
| 0.010000000000001823 | -5.572 |
| 0.010100000000001823 | -5.622 |
| 0.010200000000001822 | -5.671 |
| 0.010300000000001822 | -5.721 |
| 0.010400000000001821 | -5.77 |
| 0.01050000000000182 | -5.819 |
| 0.01060000000000182 | -5.869 |
| 0.01070000000000182 | -5.918 |
| 0.010800000000001819 | -5.968 |
| 0.010900000000001818 | -6.017 |
| 0.011000000000001817 | -6.067 |
| 0.011100000000001817 | -6.116 |
| 0.011200000000001816 | -6.165 |
| 0.011300000000001816 | -6.215 |
| 0.011400000000001815 | -6.264 |
| 0.011500000000001814 | -6.314 |
| 0.011600000000001814 | -6.363 |
| 0.011700000000001813 | -6.412 |
| 0.011800000000001813 | -6.462 |
| 0.011900000000001812 | -6.511 |
| 0.012000000000001811 | -6.561 |
| 0.01210000000000181 | -6.61 |
| 0.01220000000000181 | -6.659 |
| 0.01230000000000181 | -6.709 |
| 0.012400000000001809 | -6.758 |
| 0.012500000000001808 | -6.807 |
| 0.012600000000001808 | -6.857 |
| 0.012700000000001807 | -6.906 |
| 0.012800000000001806 | -6.955 |
| 0.012900000000001806 | -7.005 |
| 0.013000000000001805 | -7.054 |
| 0.013100000000001805 | -7.103 |
| 0.013200000000001804 | -7.153 |
| 0.013300000000001803 | -7.202 |
| 0.013400000000001803 | -7.251 |
| 0.013500000000001802 | -7.301 |
| 0.013600000000001802 | -7.35 |
| 0.013700000000001801 | -7.399 |
| 0.0138000000000018 | -7.449 |
| 0.0139000000000018 | -7.498 |
| 0.0140000000000018 | -7.547 |
| 0.014100000000001799 | -7.596 |
| 0.014200000000001798 | -7.646 |
| 0.014300000000001797 | -7.695 |
| 0.014400000000001797 | -7.744 |
| 0.014500000000001796 | -7.793 |
| 0.014600000000001796 | -7.843 |
| 0.014700000000001795 | -7.892 |
| 0.014800000000001794 | -7.941 |
| 0.014900000000001794 | -7.99 |
| 0.015000000000001793 | -8.04 |
| 0.015100000000001793 | -8.089 |
| 0.015200000000001792 | -8.138 |
| 0.015300000000001791 | -8.187 |
| 0.01540000000000179 | -8.237 |
| 0.01550000000000179 | -8.286 |
| 0.01560000000000179 | -8.335 |
| 0.01570000000000179 | -8.384 |
| 0.01580000000000179 | -8.433 |
| 0.015900000000001788 | -8.483 |
| 0.016000000000001787 | -8.532 |
| 0.016100000000001786 | -8.581 |
| 0.016200000000001786 | -8.63 |
| 0.016300000000001785 | -8.679 |
| 0.016400000000001785 | -8.728 |
| 0.016500000000001784 | -8.778 |
| 0.016600000000001783 | -8.827 |
| 0.016700000000001783 | -8.876 |
| 0.016800000000001782 | -8.925 |
| 0.01690000000000178 | -8.974 |
| 0.01700000000000178 | -9.023 |
| 0.01710000000000178 | -9.072 |
| 0.01720000000000178 | -9.122 |
| 0.01730000000000178 | -9.171 |
| 0.01740000000000178 | -9.22 |
| 0.017500000000001778 | -9.269 |
| 0.017600000000001777 | -9.318 |
| 0.017700000000001777 | -9.367 |
| 0.017800000000001776 | -9.416 |
| 0.017900000000001776 | -9.465 |
| 0.018000000000001775 | -9.514 |
| 0.018100000000001774 | -9.563 |
| 0.018200000000001774 | -9.613 |
| 0.018300000000001773 | -9.662 |
| 0.018400000000001773 | -9.711 |
| 0.018500000000001772 | -9.76 |
| 0.01860000000000177 | -9.809 |
| 0.01870000000000177 | -9.858 |
| 0.01880000000000177 | -9.907 |
| 0.01890000000000177 | -9.956 |
| 0.01900000000000177 | -10.005 |
| 0.01910000000000177 | -10.054 |
| 0.019200000000001768 | -10.103 |
| 0.019300000000001767 | -10.152 |
| 0.019400000000001767 | -10.201 |
| 0.019500000000001766 | -10.25 |
| 0.019600000000001765 | -10.299 |
| 0.019700000000001765 | -10.348 |
| 0.019800000000001764 | -10.397 |
| 0.019900000000001764 | -10.446 |
| 0.020000000000001763 | -10.495 |
| 0.020100000000001762 | -10.544 |
| 0.02020000000000176 | -10.593 |
| 0.02030000000000176 | -10.642 |
| 0.02040000000000176 | -10.691 |
| 0.02050000000000176 | -10.74 |
| 0.02060000000000176 | -10.789 |
| 0.02070000000000176 | -10.838 |
| 0.020800000000001758 | -10.887 |
| 0.020900000000001757 | -10.936 |
| 0.021000000000001757 | -10.985 |
| 0.021100000000001756 | -11.034 |
| 0.021200000000001756 | -11.083 |
| 0.021300000000001755 | -11.131 |
| 0.021400000000001754 | -11.18 |
| 0.021500000000001754 | -11.229 |
| 0.021600000000001753 | -11.278 |
| 0.021700000000001753 | -11.327 |
| 0.021800000000001752 | -11.376 |
| 0.02190000000000175 | -11.425 |
| 0.02200000000000175 | -11.474 |
| 0.02210000000000175 | -11.523 |
| 0.02220000000000175 | -11.572 |
| 0.02230000000000175 | -11.62 |
| 0.02240000000000175 | -11.669 |
| 0.022500000000001748 | -11.718 |
| 0.022600000000001747 | -11.767 |
| 0.022700000000001747 | -11.816 |
| 0.022800000000001746 | -11.865 |
| 0.022900000000001745 | -11.914 |
| 0.023000000000001745 | -11.962 |
| 0.023100000000001744 | -12.011 |
| 0.023200000000001744 | -12.06 |
| 0.023300000000001743 | -12.109 |
| 0.023400000000001742 | -12.158 |
| 0.02350000000000174 | -12.207 |
| 0.02360000000000174 | -12.255 |
| 0.02370000000000174 | -12.304 |
| 0.02380000000000174 | -12.353 |
| 0.02390000000000174 | -12.402 |
| 0.02400000000000174 | -12.451 |
| 0.024100000000001738 | -12.499 |
| 0.024200000000001737 | -12.548 |
| 0.024300000000001737 | -12.597 |
| 0.024400000000001736 | -12.646 |
| 0.024500000000001736 | -12.694 |
| 0.024600000000001735 | -12.743 |
| 0.024700000000001734 | -12.792 |
| 0.024800000000001734 | -12.841 |
| 0.024900000000001733 | -12.89 |
| 0.025000000000001733 | -12.938 |
| 0.025100000000001732 | -12.987 |
| 0.02520000000000173 | -13.036 |
| 0.02530000000000173 | -13.084 |
| 0.02540000000000173 | -13.133 |
| 0.02550000000000173 | -13.182 |
| 0.02560000000000173 | -13.231 |
| 0.02570000000000173 | -13.279 |
| 0.025800000000001728 | -13.328 |
| 0.025900000000001727 | -13.377 |
| 0.026000000000001727 | -13.425 |
| 0.026100000000001726 | -13.474 |
| 0.026200000000001725 | -13.523 |
| 0.026300000000001725 | -13.572 |
| 0.026400000000001724 | -13.62 |
| 0.026500000000001724 | -13.669 |
| 0.026600000000001723 | -13.718 |
| 0.026700000000001722 | -13.766 |
| 0.026800000000001722 | -13.815 |
| 0.02690000000000172 | -13.864 |
| 0.02700000000000172 | -13.912 |
| 0.02710000000000172 | -13.961 |
| 0.02720000000000172 | -14.009 |
| 0.02730000000000172 | -14.058 |
| 0.027400000000001718 | -14.107 |
| 0.027500000000001718 | -14.155 |
| 0.027600000000001717 | -14.204 |
| 0.027700000000001716 | -14.253 |
| 0.027800000000001716 | -14.301 |
| 0.027900000000001715 | -14.35 |
| 0.028000000000001714 | -14.398 |
| 0.028100000000001714 | -14.447 |
| 0.028200000000001713 | -14.496 |
| 0.028300000000001713 | -14.544 |
| 0.028400000000001712 | -14.593 |
| 0.02850000000000171 | -14.641 |
| 0.02860000000000171 | -14.69 |
| 0.02870000000000171 | -14.739 |
| 0.02880000000000171 | -14.787 |
| 0.02890000000000171 | -14.836 |
| 0.02900000000000171 | -14.884 |
| 0.029100000000001708 | -14.933 |
| 0.029200000000001707 | -14.981 |
| 0.029300000000001707 | -15.03 |
| 0.029400000000001706 | -15.078 |
| 0.029500000000001705 | -15.127 |
| 0.029600000000001705 | -15.175 |
| 0.029700000000001704 | -15.224 |
| 0.029800000000001704 | -15.272 |
| 0.029900000000001703 | -15.321 |
| 0.030000000000001702 | -15.369 |
| 0.030100000000001702 | -15.418 |
| 0.0302000000000017 | -15.466 |
| 0.0303000000000017 | -15.515 |
| 0.0304000000000017 | -15.563 |
| 0.0305000000000017 | -15.612 |
| 0.0306000000000017 | -15.66 |
| 0.030700000000001698 | -15.709 |
| 0.030800000000001698 | -15.757 |
| 0.030900000000001697 | -15.806 |
| 0.031000000000001696 | -15.854 |
| 0.031100000000001696 | -15.903 |
| 0.031200000000001695 | -15.951 |
| 0.031300000000001695 | -16 |
| 0.0314000000000017 | -16.048 |
| 0.0315000000000017 | -16.096 |
| 0.0316000000000017 | -16.145 |
| 0.031700000000001706 | -16.193 |
| 0.03180000000000171 | -16.242 |
| 0.03190000000000171 | -16.29 |
| 0.032000000000001715 | -16.339 |
| 0.03210000000000172 | -16.387 |
| 0.03220000000000172 | -16.435 |
| 0.03230000000000172 | -16.484 |
| 0.032400000000001726 | -16.532 |
| 0.03250000000000173 | -16.581 |
| 0.03260000000000173 | -16.629 |
| 0.032700000000001735 | -16.677 |
| 0.03280000000000174 | -16.726 |
| 0.03290000000000174 | -16.774 |
| 0.03300000000000174 | -16.822 |
| 0.033100000000001746 | -16.871 |
| 0.03320000000000175 | -16.919 |
| 0.03330000000000175 | -16.967 |
| 0.033400000000001755 | -17.016 |
| 0.03350000000000176 | -17.064 |
| 0.03360000000000176 | -17.113 |
| 0.03370000000000176 | -17.161 |
| 0.033800000000001766 | -17.209 |
| 0.03390000000000177 | -17.257 |
| 0.03400000000000177 | -17.306 |
| 0.034100000000001775 | -17.354 |
| 0.03420000000000178 | -17.402 |
| 0.03430000000000178 | -17.451 |
| 0.03440000000000178 | -17.499 |
| 0.034500000000001786 | -17.547 |
| 0.03460000000000179 | -17.596 |
| 0.03470000000000179 | -17.644 |
| 0.034800000000001795 | -17.692 |
| 0.0349000000000018 | -17.74 |
| 0.0350000000000018 | -17.789 |
| 0.0351000000000018 | -17.837 |
| 0.035200000000001806 | -17.885 |
| 0.03530000000000181 | -17.933 |
| 0.03540000000000181 | -17.982 |
| 0.035500000000001815 | -18.03 |
| 0.03560000000000182 | -18.078 |
| 0.03570000000000182 | -18.126 |
| 0.03580000000000182 | -18.175 |
| 0.035900000000001826 | -18.223 |
| 0.03600000000000183 | -18.271 |
| 0.03610000000000183 | -18.319 |
| 0.036200000000001835 | -18.368 |
| 0.03630000000000184 | -18.416 |
| 0.03640000000000184 | -18.464 |
| 0.036500000000001843 | -18.512 |
| 0.036600000000001846 | -18.56 |
| 0.03670000000000185 | -18.609 |
| 0.03680000000000185 | -18.657 |
| 0.036900000000001855 | -18.705 |
| 0.03700000000000186 | -18.753 |
| 0.03710000000000186 | -18.801 |
| 0.037200000000001864 | -18.849 |
| 0.037300000000001866 | -18.898 |
| 0.03740000000000187 | -18.946 |
| 0.03750000000000187 | -18.994 |
| 0.037600000000001875 | -19.042 |
| 0.03770000000000188 | -19.09 |
| 0.03780000000000188 | -19.138 |
| 0.037900000000001884 | -19.186 |
| 0.038000000000001886 | -19.235 |
| 0.03810000000000189 | -19.283 |
| 0.03820000000000189 | -19.331 |
| 0.038300000000001895 | -19.379 |
| 0.0384000000000019 | -19.427 |
| 0.0385000000000019 | -19.475 |
| 0.038600000000001904 | -19.523 |
| 0.038700000000001906 | -19.571 |
| 0.03880000000000191 | -19.619 |
| 0.03890000000000191 | -19.667 |
| 0.039000000000001915 | -19.716 |
| 0.03910000000000192 | -19.764 |
| 0.03920000000000192 | -19.812 |
| 0.039300000000001924 | -19.86 |
| 0.03940000000000193 | -19.908 |
| 0.03950000000000193 | -19.956 |
| 0.03960000000000193 | -20.004 |
| 0.039700000000001935 | -20.052 |
| 0.03980000000000194 | -20.1 |
| 0.03990000000000194 | -20.148 |
| 0.040000000000001944 | -20.196 |
| 0.04010000000000195 | -20.244 |
| 0.04020000000000195 | -20.292 |
| 0.04030000000000195 | -20.34 |
| 0.040400000000001955 | -20.388 |
| 0.04050000000000196 | -20.436 |
| 0.04060000000000196 | -20.484 |
| 0.040700000000001964 | -20.532 |
| 0.04080000000000197 | -20.58 |
| 0.04090000000000197 | -20.628 |
| 0.04100000000000197 | -20.676 |
| 0.041100000000001975 | -20.724 |
| 0.04120000000000198 | -20.772 |
| 0.04130000000000198 | -20.82 |
| 0.041400000000001984 | -20.868 |
| 0.04150000000000199 | -20.916 |
| 0.04160000000000199 | -20.964 |
| 0.04170000000000199 | -21.012 |
| 0.041800000000001995 | -21.06 |
| 0.041900000000002 | -21.108 |
| 0.042000000000002 | -21.156 |
| 0.042100000000002004 | -21.204 |
| 0.04220000000000201 | -21.252 |
| 0.04230000000000201 | -21.3 |
| 0.04240000000000201 | -21.347 |
| 0.042500000000002015 | -21.395 |
| 0.04260000000000202 | -21.443 |
| 0.04270000000000202 | -21.491 |
| 0.042800000000002024 | -21.539 |
| 0.04290000000000203 | -21.587 |
| 0.04300000000000203 | -21.635 |
| 0.04310000000000203 | -21.683 |
| 0.043200000000002035 | -21.731 |
| 0.04330000000000204 | -21.778 |
| 0.04340000000000204 | -21.826 |
| 0.043500000000002044 | -21.874 |
| 0.04360000000000205 | -21.922 |
| 0.04370000000000205 | -21.97 |
| 0.04380000000000205 | -22.018 |
| 0.043900000000002055 | -22.066 |
| 0.04400000000000206 | -22.114 |
| 0.04410000000000206 | -22.161 |
| 0.044200000000002064 | -22.209 |
| 0.04430000000000207 | -22.257 |
| 0.04440000000000207 | -22.305 |
| 0.04450000000000207 | -22.353 |
| 0.044600000000002075 | -22.4 |
| 0.04470000000000208 | -22.448 |
| 0.04480000000000208 | -22.496 |
| 0.044900000000002084 | -22.544 |
| 0.04500000000000209 | -22.592 |
| 0.04510000000000209 | -22.639 |
| 0.04520000000000209 | -22.687 |
| 0.045300000000002096 | -22.735 |
| 0.0454000000000021 | -22.783 |
| 0.0455000000000021 | -22.831 |
| 0.045600000000002104 | -22.878 |
| 0.04570000000000211 | -22.926 |
| 0.04580000000000211 | -22.974 |
| 0.04590000000000211 | -23.022 |
| 0.046000000000002116 | -23.069 |
| 0.04610000000000212 | -23.117 |
| 0.04620000000000212 | -23.165 |
| 0.046300000000002124 | -23.213 |
| 0.04640000000000213 | -23.26 |
| 0.04650000000000213 | -23.308 |
| 0.04660000000000213 | -23.356 |
| 0.046700000000002136 | -23.404 |
| 0.04680000000000214 | -23.451 |
| 0.04690000000000214 | -23.499 |
| 0.047000000000002144 | -23.547 |
| 0.04710000000000215 | -23.594 |
| 0.04720000000000215 | -23.642 |
| 0.04730000000000215 | -23.69 |
| 0.047400000000002156 | -23.737 |
| 0.04750000000000216 | -23.785 |
| 0.04760000000000216 | -23.833 |
| 0.047700000000002164 | -23.88 |
| 0.04780000000000217 | -23.928 |
| 0.04790000000000217 | -23.976 |
| 0.04800000000000217 | -24.023 |
| 0.048100000000002176 | -24.071 |
| 0.04820000000000218 | -24.119 |
| 0.04830000000000218 | -24.166 |
| 0.048400000000002184 | -24.214 |
| 0.04850000000000219 | -24.262 |
| 0.04860000000000219 | -24.309 |
| 0.04870000000000219 | -24.357 |
| 0.048800000000002196 | -24.405 |
| 0.0489000000000022 | -24.452 |
| 0.0490000000000022 | -24.5 |
| 0.049100000000002204 | -24.547 |
| 0.04920000000000221 | -24.595 |
| 0.04930000000000221 | -24.643 |
| 0.04940000000000221 | -24.69 |
| 0.049500000000002216 | -24.738 |
| 0.04960000000000222 | -24.785 |
| 0.04970000000000222 | -24.833 |
| 0.049800000000002224 | -24.88 |
| 0.04990000000000223 | -24.928 |
| 0.05000000000000223 | -24.976 |
| 0.05010000000000223 | -25.023 |
| 0.050200000000002236 | -25.071 |
| 0.05030000000000224 | -25.118 |
| 0.05040000000000224 | -25.166 |
| 0.050500000000002244 | -25.213 |
| 0.05060000000000225 | -25.261 |
| 0.05070000000000225 | -25.308 |
| 0.05080000000000225 | -25.356 |
| 0.050900000000002256 | -25.403 |
| 0.05100000000000226 | -25.451 |
| 0.05110000000000226 | -25.499 |
| 0.051200000000002265 | -25.546 |
| 0.05130000000000227 | -25.594 |
| 0.05140000000000227 | -25.641 |
| 0.05150000000000227 | -25.689 |
| 0.051600000000002276 | -25.736 |
| 0.05170000000000228 | -25.783 |
| 0.05180000000000228 | -25.831 |
| 0.051900000000002285 | -25.878 |
| 0.05200000000000229 | -25.926 |
| 0.05210000000000229 | -25.973 |
| 0.05220000000000229 | -26.021 |
| 0.052300000000002296 | -26.068 |
| 0.0524000000000023 | -26.116 |
| 0.0525000000000023 | -26.163 |
| 0.052600000000002305 | -26.211 |
| 0.05270000000000231 | -26.258 |
| 0.05280000000000231 | -26.306 |
| 0.05290000000000231 | -26.353 |
| 0.053000000000002316 | -26.4 |
| 0.05310000000000232 | -26.448 |
| 0.05320000000000232 | -26.495 |
| 0.053300000000002325 | -26.543 |
| 0.05340000000000233 | -26.59 |
| 0.05350000000000233 | -26.637 |
| 0.05360000000000233 | -26.685 |
| 0.053700000000002336 | -26.732 |
| 0.05380000000000234 | -26.78 |
| 0.05390000000000234 | -26.827 |
| 0.054000000000002345 | -26.874 |
| 0.05410000000000235 | -26.922 |
| 0.05420000000000235 | -26.969 |
| 0.05430000000000235 | -27.017 |
| 0.054400000000002356 | -27.064 |
| 0.05450000000000236 | -27.111 |
| 0.05460000000000236 | -27.159 |
| 0.054700000000002365 | -27.206 |
| 0.05480000000000237 | -27.253 |
| 0.05490000000000237 | -27.301 |
| 0.05500000000000237 | -27.348 |
| 0.055100000000002376 | -27.395 |
| 0.05520000000000238 | -27.443 |
| 0.05530000000000238 | -27.49 |
| 0.055400000000002385 | -27.537 |
| 0.05550000000000239 | -27.585 |
| 0.05560000000000239 | -27.632 |
| 0.05570000000000239 | -27.679 |
| 0.055800000000002396 | -27.726 |
| 0.0559000000000024 | -27.774 |
| 0.0560000000000024 | -27.821 |
| 0.056100000000002405 | -27.868 |
| 0.05620000000000241 | -27.916 |
| 0.05630000000000241 | -27.963 |
| 0.056400000000002413 | -28.01 |
| 0.056500000000002416 | -28.057 |
| 0.05660000000000242 | -28.105 |
| 0.05670000000000242 | -28.152 |
| 0.056800000000002425 | -28.199 |
| 0.05690000000000243 | -28.246 |
| 0.05700000000000243 | -28.294 |
| 0.057100000000002434 | -28.341 |
| 0.057200000000002436 | -28.388 |
| 0.05730000000000244 | -28.435 |
| 0.05740000000000244 | -28.483 |
| 0.057500000000002445 | -28.53 |
| 0.05760000000000245 | -28.577 |
| 0.05770000000000245 | -28.624 |
| 0.057800000000002454 | -28.671 |
| 0.057900000000002456 | -28.719 |
| 0.05800000000000246 | -28.766 |
| 0.05810000000000246 | -28.813 |
| 0.058200000000002465 | -28.86 |
| 0.05830000000000247 | -28.907 |
| 0.05840000000000247 | -28.955 |
| 0.058500000000002474 | -29.002 |
| 0.058600000000002476 | -29.049 |
| 0.05870000000000248 | -29.096 |
| 0.05880000000000248 | -29.143 |
| 0.058900000000002485 | -29.19 |
| 0.05900000000000249 | -29.237 |
| 0.05910000000000249 | -29.285 |
| 0.059200000000002494 | -29.332 |
| 0.0593000000000025 | -29.379 |
| 0.0594000000000025 | -29.426 |
| 0.0595000000000025 | -29.473 |
| 0.059600000000002505 | -29.52 |
| 0.05970000000000251 | -29.567 |
| 0.05980000000000251 | -29.615 |
| 0.059900000000002514 | -29.662 |
| 0.06000000000000252 | -29.709 |
| 0.06010000000000252 | -29.756 |
| 0.06020000000000252 | -29.803 |
| 0.060300000000002525 | -29.85 |
| 0.06040000000000253 | -29.897 |
| 0.06050000000000253 | -29.944 |
| 0.060600000000002534 | -29.991 |
| 0.06070000000000254 | -30.038 |
| 0.06080000000000254 | -30.085 |
| 0.06090000000000254 | -30.132 |
| 0.061000000000002545 | -30.18 |
| 0.06110000000000255 | -30.227 |
| 0.06120000000000255 | -30.274 |
| 0.061300000000002554 | -30.321 |
| 0.06140000000000256 | -30.368 |
| 0.06150000000000256 | -30.415 |
| 0.06160000000000256 | -30.462 |
| 0.061700000000002565 | -30.509 |
| 0.06180000000000257 | -30.556 |
| 0.06190000000000257 | -30.603 |
| 0.062000000000002574 | -30.65 |
| 0.06210000000000258 | -30.697 |
| 0.06220000000000258 | -30.744 |
| 0.06230000000000258 | -30.791 |
| 0.062400000000002585 | -30.838 |
| 0.06250000000000258 | -30.885 |
| 0.06260000000000258 | -30.932 |
| 0.06270000000000259 | -30.979 |
| 0.06280000000000259 | -31.026 |
| 0.06290000000000259 | -31.073 |
| 0.0630000000000026 | -31.12 |
| 0.0631000000000026 | -31.167 |
| 0.0632000000000026 | -31.214 |
| 0.0633000000000026 | -31.261 |
| 0.06340000000000261 | -31.308 |
| 0.06350000000000261 | -31.354 |
| 0.06360000000000261 | -31.401 |
| 0.06370000000000262 | -31.448 |
| 0.06380000000000262 | -31.495 |
| 0.06390000000000262 | -31.542 |
| 0.06400000000000262 | -31.589 |
| 0.06410000000000263 | -31.636 |
| 0.06420000000000263 | -31.683 |
| 0.06430000000000263 | -31.73 |
| 0.06440000000000264 | -31.777 |
| 0.06450000000000264 | -31.824 |
| 0.06460000000000264 | -31.871 |
| 0.06470000000000264 | -31.917 |
| 0.06480000000000265 | -31.964 |
| 0.06490000000000265 | -32.011 |
| 0.06500000000000265 | -32.058 |
| 0.06510000000000266 | -32.105 |
| 0.06520000000000266 | -32.152 |
| 0.06530000000000266 | -32.199 |
| 0.06540000000000266 | -32.246 |
| 0.06550000000000267 | -32.292 |
| 0.06560000000000267 | -32.339 |
| 0.06570000000000267 | -32.386 |
| 0.06580000000000268 | -32.433 |
| 0.06590000000000268 | -32.48 |
| 0.06600000000000268 | -32.527 |
| 0.06610000000000268 | -32.573 |
| 0.06620000000000269 | -32.62 |
| 0.06630000000000269 | -32.667 |
| 0.06640000000000269 | -32.714 |
| 0.0665000000000027 | -32.761 |
| 0.0666000000000027 | -32.808 |
| 0.0667000000000027 | -32.854 |
| 0.0668000000000027 | -32.901 |
| 0.06690000000000271 | -32.948 |
| 0.06700000000000271 | -32.995 |
| 0.06710000000000271 | -33.041 |
| 0.06720000000000272 | -33.088 |
| 0.06730000000000272 | -33.135 |
| 0.06740000000000272 | -33.182 |
| 0.06750000000000272 | -33.229 |
| 0.06760000000000273 | -33.275 |
| 0.06770000000000273 | -33.322 |
| 0.06780000000000273 | -33.369 |
| 0.06790000000000274 | -33.416 |
| 0.06800000000000274 | -33.462 |
| 0.06810000000000274 | -33.509 |
| 0.06820000000000274 | -33.556 |
| 0.06830000000000275 | -33.602 |
| 0.06840000000000275 | -33.649 |
| 0.06850000000000275 | -33.696 |
| 0.06860000000000276 | -33.743 |
| 0.06870000000000276 | -33.789 |
| 0.06880000000000276 | -33.836 |
| 0.06890000000000276 | -33.883 |
| 0.06900000000000277 | -33.929 |
| 0.06910000000000277 | -33.976 |
| 0.06920000000000277 | -34.023 |
| 0.06930000000000278 | -34.069 |
| 0.06940000000000278 | -34.116 |
| 0.06950000000000278 | -34.163 |
| 0.06960000000000278 | -34.21 |
| 0.06970000000000279 | -34.256 |
| 0.06980000000000279 | -34.303 |
| 0.0699000000000028 | -34.349 |
| 0.0700000000000028 | -34.396 |
| 0.0701000000000028 | -34.443 |
| 0.0702000000000028 | -34.489 |
| 0.0703000000000028 | -34.536 |
| 0.07040000000000281 | -34.583 |
| 0.07050000000000281 | -34.629 |
| 0.07060000000000281 | -34.676 |
| 0.07070000000000282 | -34.723 |
| 0.07080000000000282 | -34.769 |
| 0.07090000000000282 | -34.816 |
| 0.07100000000000282 | -34.862 |
| 0.07110000000000283 | -34.909 |
| 0.07120000000000283 | -34.956 |
| 0.07130000000000283 | -35.002 |
| 0.07140000000000284 | -35.049 |
| 0.07150000000000284 | -35.095 |
| 0.07160000000000284 | -35.142 |
| 0.07170000000000284 | -35.188 |
| 0.07180000000000285 | -35.235 |
| 0.07190000000000285 | -35.282 |
| 0.07200000000000285 | -35.328 |
| 0.07210000000000286 | -35.375 |
| 0.07220000000000286 | -35.421 |
| 0.07230000000000286 | -35.468 |
| 0.07240000000000286 | -35.514 |
| 0.07250000000000287 | -35.561 |
| 0.07260000000000287 | -35.607 |
| 0.07270000000000287 | -35.654 |
| 0.07280000000000288 | -35.701 |
| 0.07290000000000288 | -35.747 |
| 0.07300000000000288 | -35.794 |
| 0.07310000000000288 | -35.84 |
| 0.07320000000000289 | -35.887 |
| 0.07330000000000289 | -35.933 |
| 0.0734000000000029 | -35.98 |
| 0.0735000000000029 | -36.026 |
| 0.0736000000000029 | -36.073 |
| 0.0737000000000029 | -36.119 |
| 0.0738000000000029 | -36.165 |
| 0.07390000000000291 | -36.212 |
| 0.07400000000000291 | -36.258 |
| 0.07410000000000291 | -36.305 |
| 0.07420000000000292 | -36.351 |
| 0.07430000000000292 | -36.398 |
| 0.07440000000000292 | -36.444 |
| 0.07450000000000292 | -36.491 |
| 0.07460000000000293 | -36.537 |
| 0.07470000000000293 | -36.584 |
| 0.07480000000000293 | -36.63 |
| 0.07490000000000294 | -36.676 |
| 0.07500000000000294 | -36.723 |
| 0.07510000000000294 | -36.769 |
| 0.07520000000000295 | -36.816 |
| 0.07530000000000295 | -36.862 |
| 0.07540000000000295 | -36.909 |
| 0.07550000000000295 | -36.955 |
| 0.07560000000000296 | -37.001 |
| 0.07570000000000296 | -37.048 |
| 0.07580000000000296 | -37.094 |
| 0.07590000000000297 | -37.141 |
| 0.07600000000000297 | -37.187 |
| 0.07610000000000297 | -37.233 |
| 0.07620000000000297 | -37.28 |
| 0.07630000000000298 | -37.326 |
| 0.07640000000000298 | -37.372 |
| 0.07650000000000298 | -37.419 |
| 0.07660000000000299 | -37.465 |
| 0.07670000000000299 | -37.511 |
| 0.07680000000000299 | -37.558 |
| 0.076900000000003 | -37.604 |
| 0.077000000000003 | -37.65 |
| 0.077100000000003 | -37.697 |
| 0.077200000000003 | -37.743 |
| 0.077300000000003 | -37.789 |
| 0.07740000000000301 | -37.836 |
| 0.07750000000000301 | -37.882 |
| 0.07760000000000301 | -37.928 |
| 0.07770000000000302 | -37.975 |
| 0.07780000000000302 | -38.021 |
| 0.07790000000000302 | -38.067 |
| 0.07800000000000303 | -38.114 |
| 0.07810000000000303 | -38.16 |
| 0.07820000000000303 | -38.206 |
| 0.07830000000000303 | -38.252 |
| 0.07840000000000304 | -38.299 |
| 0.07850000000000304 | -38.345 |
| 0.07860000000000304 | -38.391 |
| 0.07870000000000305 | -38.437 |
| 0.07880000000000305 | -38.484 |
| 0.07890000000000305 | -38.53 |
| 0.07900000000000305 | -38.576 |
| 0.07910000000000306 | -38.622 |
| 0.07920000000000306 | -38.669 |
| 0.07930000000000306 | -38.715 |
| 0.07940000000000307 | -38.761 |
| 0.07950000000000307 | -38.807 |
| 0.07960000000000307 | -38.854 |
| 0.07970000000000307 | -38.9 |
| 0.07980000000000308 | -38.946 |
| 0.07990000000000308 | -38.992 |
| 0.08000000000000308 | -39.038 |
| 0.08010000000000309 | -39.085 |
| 0.08020000000000309 | -39.131 |
| 0.08030000000000309 | -39.177 |
| 0.0804000000000031 | -39.223 |
| 0.0805000000000031 | -39.269 |
| 0.0806000000000031 | -39.316 |
| 0.0807000000000031 | -39.362 |
| 0.0808000000000031 | -39.408 |
| 0.08090000000000311 | -39.454 |
| 0.08100000000000311 | -39.5 |
| 0.08110000000000311 | -39.546 |
| 0.08120000000000312 | -39.593 |
| 0.08130000000000312 | -39.639 |
| 0.08140000000000312 | -39.685 |
| 0.08150000000000313 | -39.731 |
| 0.08160000000000313 | -39.777 |
| 0.08170000000000313 | -39.823 |
| 0.08180000000000313 | -39.869 |
| 0.08190000000000314 | -39.915 |
| 0.08200000000000314 | -39.962 |
| 0.08210000000000314 | -40.008 |
| 0.08220000000000315 | -40.054 |
| 0.08230000000000315 | -40.1 |
| 0.08240000000000315 | -40.146 |
| 0.08250000000000315 | -40.192 |
| 0.08260000000000316 | -40.238 |
| 0.08270000000000316 | -40.284 |
| 0.08280000000000316 | -40.33 |
| 0.08290000000000317 | -40.376 |
| 0.08300000000000317 | -40.422 |
| 0.08310000000000317 | -40.469 |
| 0.08320000000000317 | -40.515 |
| 0.08330000000000318 | -40.561 |
| 0.08340000000000318 | -40.607 |
| 0.08350000000000318 | -40.653 |
| 0.08360000000000319 | -40.699 |
| 0.08370000000000319 | -40.745 |
| 0.08380000000000319 | -40.791 |
| 0.0839000000000032 | -40.837 |
| 0.0840000000000032 | -40.883 |
| 0.0841000000000032 | -40.929 |
| 0.0842000000000032 | -40.975 |
| 0.0843000000000032 | -41.021 |
| 0.08440000000000321 | -41.067 |
| 0.08450000000000321 | -41.113 |
| 0.08460000000000321 | -41.159 |
| 0.08470000000000322 | -41.205 |
| 0.08480000000000322 | -41.251 |
| 0.08490000000000322 | -41.297 |
| 0.08500000000000323 | -41.343 |
| 0.08510000000000323 | -41.389 |
| 0.08520000000000323 | -41.435 |
| 0.08530000000000323 | -41.481 |
| 0.08540000000000324 | -41.527 |
| 0.08550000000000324 | -41.573 |
| 0.08560000000000324 | -41.619 |
| 0.08570000000000325 | -41.665 |
| 0.08580000000000325 | -41.711 |
| 0.08590000000000325 | -41.757 |
| 0.08600000000000325 | -41.802 |
| 0.08610000000000326 | -41.848 |
| 0.08620000000000326 | -41.894 |
| 0.08630000000000326 | -41.94 |
| 0.08640000000000327 | -41.986 |
| 0.08650000000000327 | -42.032 |
| 0.08660000000000327 | -42.078 |
| 0.08670000000000327 | -42.124 |
| 0.08680000000000328 | -42.17 |
| 0.08690000000000328 | -42.216 |
| 0.08700000000000328 | -42.262 |
| 0.08710000000000329 | -42.308 |
| 0.08720000000000329 | -42.353 |
| 0.08730000000000329 | -42.399 |
| 0.0874000000000033 | -42.445 |
| 0.0875000000000033 | -42.491 |
| 0.0876000000000033 | -42.537 |
| 0.0877000000000033 | -42.583 |
| 0.0878000000000033 | -42.629 |
| 0.08790000000000331 | -42.674 |
| 0.08800000000000331 | -42.72 |
| 0.08810000000000331 | -42.766 |
| 0.08820000000000332 | -42.812 |
| 0.08830000000000332 | -42.858 |
| 0.08840000000000332 | -42.904 |
| 0.08850000000000333 | -42.949 |
| 0.08860000000000333 | -42.995 |
| 0.08870000000000333 | -43.041 |
| 0.08880000000000333 | -43.087 |
| 0.08890000000000334 | -43.133 |
| 0.08900000000000334 | -43.179 |
| 0.08910000000000334 | -43.224 |
| 0.08920000000000335 | -43.27 |
| 0.08930000000000335 | -43.316 |
| 0.08940000000000335 | -43.362 |
| 0.08950000000000335 | -43.408 |
| 0.08960000000000336 | -43.453 |
| 0.08970000000000336 | -43.499 |
| 0.08980000000000336 | -43.545 |
| 0.08990000000000337 | -43.591 |
| 0.09000000000000337 | -43.636 |
| 0.09010000000000337 | -43.682 |
| 0.09020000000000337 | -43.728 |
| 0.09030000000000338 | -43.774 |
| 0.09040000000000338 | -43.819 |
| 0.09050000000000338 | -43.865 |
| 0.09060000000000339 | -43.911 |
| 0.09070000000000339 | -43.957 |
| 0.09080000000000339 | -44.002 |
| 0.0909000000000034 | -44.048 |
| 0.0910000000000034 | -44.094 |
| 0.0911000000000034 | -44.139 |
| 0.0912000000000034 | -44.185 |
| 0.0913000000000034 | -44.231 |
| 0.09140000000000341 | -44.277 |
| 0.09150000000000341 | -44.322 |
| 0.09160000000000341 | -44.368 |
| 0.09170000000000342 | -44.414 |
| 0.09180000000000342 | -44.459 |
| 0.09190000000000342 | -44.505 |
| 0.09200000000000343 | -44.551 |
| 0.09210000000000343 | -44.596 |
| 0.09220000000000343 | -44.642 |
| 0.09230000000000343 | -44.688 |
| 0.09240000000000344 | -44.733 |
| 0.09250000000000344 | -44.779 |
| 0.09260000000000344 | -44.825 |
| 0.09270000000000345 | -44.87 |
| 0.09280000000000345 | -44.916 |
| 0.09290000000000345 | -44.962 |
| 0.09300000000000345 | -45.007 |
| 0.09310000000000346 | -45.053 |
| 0.09320000000000346 | -45.098 |
| 0.09330000000000346 | -45.144 |
| 0.09340000000000347 | -45.19 |
| 0.09350000000000347 | -45.235 |
| 0.09360000000000347 | -45.281 |
| 0.09370000000000347 | -45.326 |
| 0.09380000000000348 | -45.372 |
| 0.09390000000000348 | -45.418 |
| 0.09400000000000348 | -45.463 |
| 0.09410000000000349 | -45.509 |
| 0.09420000000000349 | -45.554 |
| 0.09430000000000349 | -45.6 |
| 0.0944000000000035 | -45.646 |
| 0.0945000000000035 | -45.691 |
| 0.0946000000000035 | -45.737 |
| 0.0947000000000035 | -45.782 |
| 0.0948000000000035 | -45.828 |
| 0.09490000000000351 | -45.873 |
| 0.09500000000000351 | -45.919 |
| 0.09510000000000352 | -45.964 |
| 0.09520000000000352 | -46.01 |
| 0.09530000000000352 | -46.055 |
| 0.09540000000000352 | -46.101 |
| 0.09550000000000353 | -46.147 |
| 0.09560000000000353 | -46.192 |
| 0.09570000000000353 | -46.238 |
| 0.09580000000000354 | -46.283 |
| 0.09590000000000354 | -46.329 |
| 0.09600000000000354 | -46.374 |
| 0.09610000000000354 | -46.42 |
| 0.09620000000000355 | -46.465 |
| 0.09630000000000355 | -46.511 |
| 0.09640000000000355 | -46.556 |
| 0.09650000000000356 | -46.601 |
| 0.09660000000000356 | -46.647 |
| 0.09670000000000356 | -46.692 |
| 0.09680000000000356 | -46.738 |
| 0.09690000000000357 | -46.783 |
| 0.09700000000000357 | -46.829 |
| 0.09710000000000357 | -46.874 |
| 0.09720000000000358 | -46.92 |
| 0.09730000000000358 | -46.965 |
| 0.09740000000000358 | -47.011 |
| 0.09750000000000358 | -47.056 |
| 0.09760000000000359 | -47.101 |
| 0.09770000000000359 | -47.147 |
| 0.09780000000000359 | -47.192 |
| 0.0979000000000036 | -47.238 |
| 0.0980000000000036 | -47.283 |
| 0.0981000000000036 | -47.329 |
| 0.0982000000000036 | -47.374 |
| 0.0983000000000036 | -47.419 |
| 0.09840000000000361 | -47.465 |
| 0.09850000000000361 | -47.51 |
| 0.09860000000000362 | -47.556 |
| 0.09870000000000362 | -47.601 |
| 0.09880000000000362 | -47.646 |
| 0.09890000000000362 | -47.692 |
| 0.09900000000000363 | -47.737 |
| 0.09910000000000363 | -47.782 |
| 0.09920000000000363 | -47.828 |
| 0.09930000000000364 | -47.873 |
| 0.09940000000000364 | -47.918 |
| 0.09950000000000364 | -47.964 |
| 0.09960000000000364 | -48.009 |
| 0.09970000000000365 | -48.054 |
| 0.09980000000000365 | -48.1 |
| 0.09990000000000365 | -48.145 |
| 0.10000000000000366 | -48.19 |